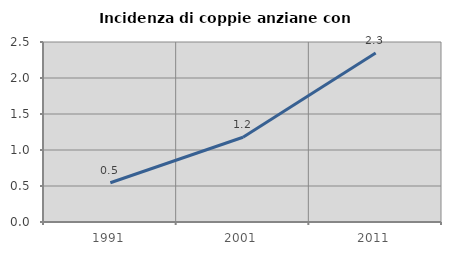
| Category | Incidenza di coppie anziane con figli |
|---|---|
| 1991.0 | 0.546 |
| 2001.0 | 1.177 |
| 2011.0 | 2.348 |